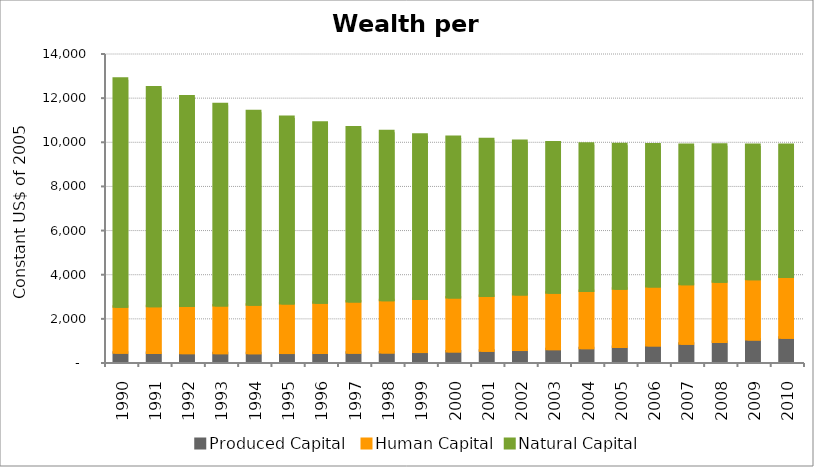
| Category | Produced Capital  | Human Capital | Natural Capital |
|---|---|---|---|
| 1990.0 | 422.22 | 2081.594 | 10333.361 |
| 1991.0 | 410.938 | 2115.702 | 9909.399 |
| 1992.0 | 400.907 | 2139.882 | 9493.65 |
| 1993.0 | 398.661 | 2164.708 | 9111.973 |
| 1994.0 | 394.692 | 2201.18 | 8770.328 |
| 1995.0 | 404.149 | 2245.385 | 8447.009 |
| 1996.0 | 410.349 | 2271.171 | 8156.769 |
| 1997.0 | 421.419 | 2315.847 | 7889.224 |
| 1998.0 | 429.716 | 2366.952 | 7660.717 |
| 1999.0 | 449.795 | 2406.113 | 7439.454 |
| 2000.0 | 479.038 | 2440.583 | 7272.37 |
| 2001.0 | 504.136 | 2483.614 | 7106.909 |
| 2002.0 | 541.765 | 2521.004 | 6952.034 |
| 2003.0 | 581.743 | 2554.494 | 6805.371 |
| 2004.0 | 626.668 | 2586.617 | 6675.935 |
| 2005.0 | 683.214 | 2631.961 | 6551.68 |
| 2006.0 | 750.815 | 2664.816 | 6442.273 |
| 2007.0 | 824.385 | 2695.133 | 6309.937 |
| 2008.0 | 910.742 | 2722.776 | 6208.522 |
| 2009.0 | 1015.08 | 2739.677 | 6081.106 |
| 2010.0 | 1096.14 | 2754.962 | 5981.175 |